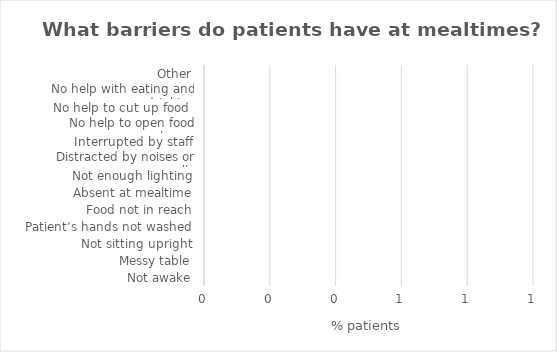
| Category | Series 0 |
|---|---|
| Not awake | 0 |
| Messy table | 0 |
| Not sitting upright | 0 |
| Patient’s hands not washed | 0 |
| Food not in reach | 0 |
| Absent at mealtime | 0 |
| Not enough lighting | 0 |
| Distracted by noises or smells | 0 |
| Interrupted by staff | 0 |
| No help to open food packages | 0 |
| No help to cut up food  | 0 |
| No help with eating and drinking | 0 |
| Other | 0 |